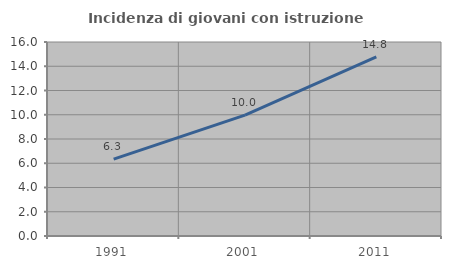
| Category | Incidenza di giovani con istruzione universitaria |
|---|---|
| 1991.0 | 6.345 |
| 2001.0 | 9.974 |
| 2011.0 | 14.773 |